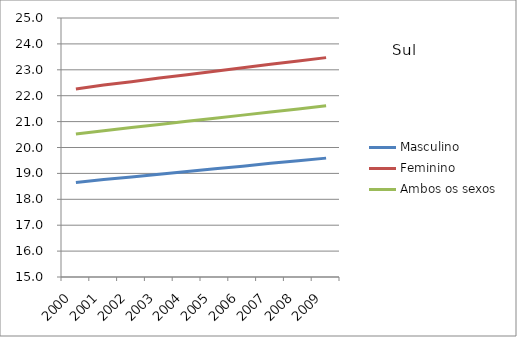
| Category | Masculino | Feminino | Ambos os sexos |
|---|---|---|---|
| 2000.0 | 18.65 | 22.26 | 20.52 |
| 2001.0 | 18.76 | 22.41 | 20.65 |
| 2002.0 | 18.86 | 22.54 | 20.77 |
| 2003.0 | 18.97 | 22.68 | 20.89 |
| 2004.0 | 19.07 | 22.81 | 21.01 |
| 2005.0 | 19.18 | 22.94 | 21.13 |
| 2006.0 | 19.28 | 23.08 | 21.25 |
| 2007.0 | 19.39 | 23.21 | 21.37 |
| 2008.0 | 19.49 | 23.34 | 21.49 |
| 2009.0 | 19.59 | 23.47 | 21.61 |